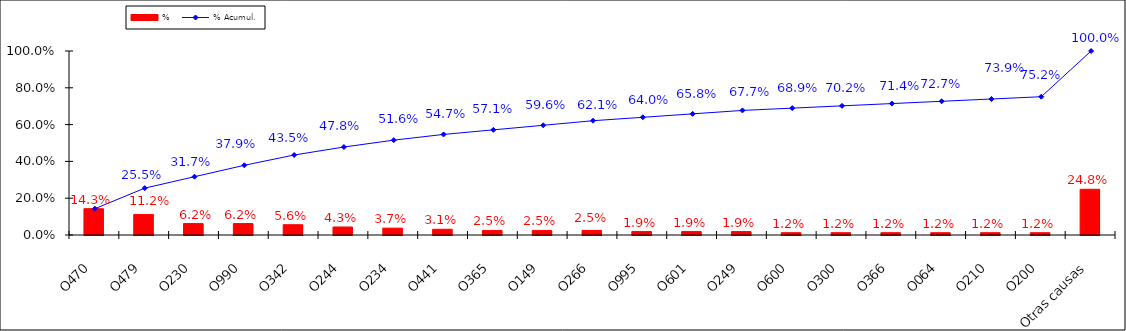
| Category | % |
|---|---|
| O470 | 0.143 |
| O479 | 0.112 |
| O230 | 0.062 |
| O990 | 0.062 |
| O342 | 0.056 |
| O244 | 0.043 |
| O234 | 0.037 |
| O441 | 0.031 |
| O365 | 0.025 |
| O149 | 0.025 |
| O266 | 0.025 |
| O995 | 0.019 |
| O601 | 0.019 |
| O249 | 0.019 |
| O600 | 0.012 |
| O300 | 0.012 |
| O366 | 0.012 |
| O064 | 0.012 |
| O210 | 0.012 |
| O200 | 0.012 |
| Otras causas | 0.248 |